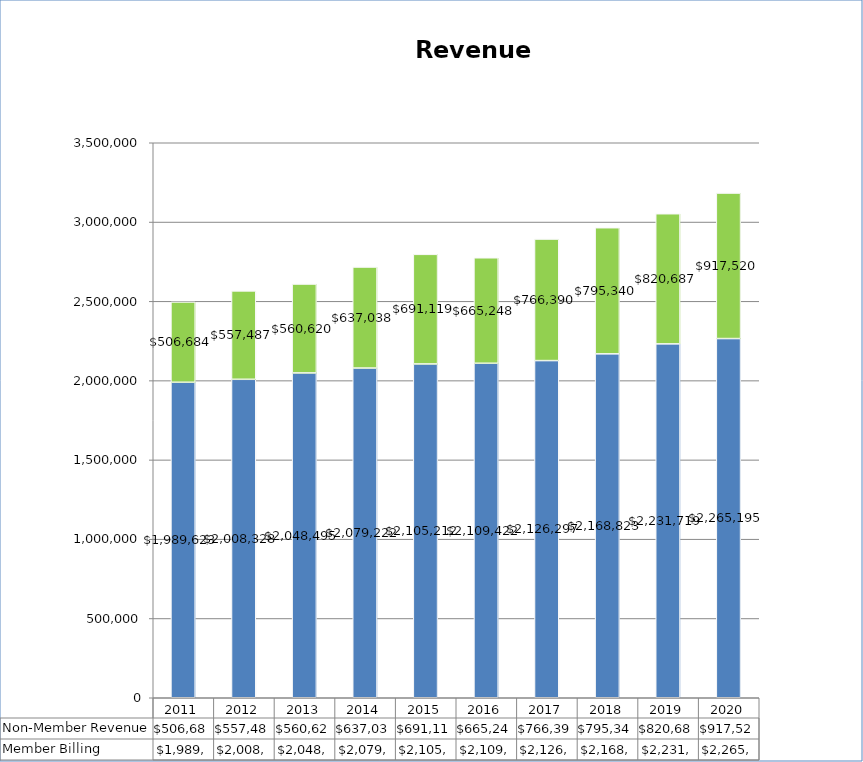
| Category | Member Billing | Non-Member Revenue |
|---|---|---|
| 2011.0 | 1989623 | 506684 |
| 2012.0 | 2008328 | 557487 |
| 2013.0 | 2048495 | 560620 |
| 2014.0 | 2079222 | 637038 |
| 2015.0 | 2105212 | 691119 |
| 2016.0 | 2109422 | 665248 |
| 2017.0 | 2126297 | 766390 |
| 2018.0 | 2168823 | 795340 |
| 2019.0 | 2231719 | 820687 |
| 2020.0 | 2265195 | 917520 |